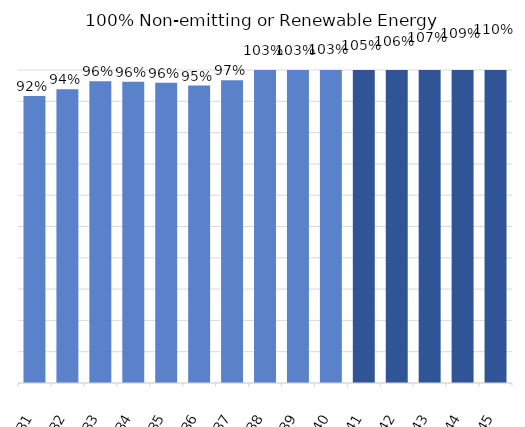
| Category | Percentage Clean Energy |
|---|---|
| 2031.0 | 0.917 |
| 2032.0 | 0.939 |
| 2033.0 | 0.964 |
| 2034.0 | 0.962 |
| 2035.0 | 0.959 |
| 2036.0 | 0.95 |
| 2037.0 | 0.967 |
| 2038.0 | 1.031 |
| 2039.0 | 1.033 |
| 2040.0 | 1.035 |
| 2041.0 | 1.047 |
| 2042.0 | 1.06 |
| 2043.0 | 1.073 |
| 2044.0 | 1.086 |
| 2045.0 | 1.099 |